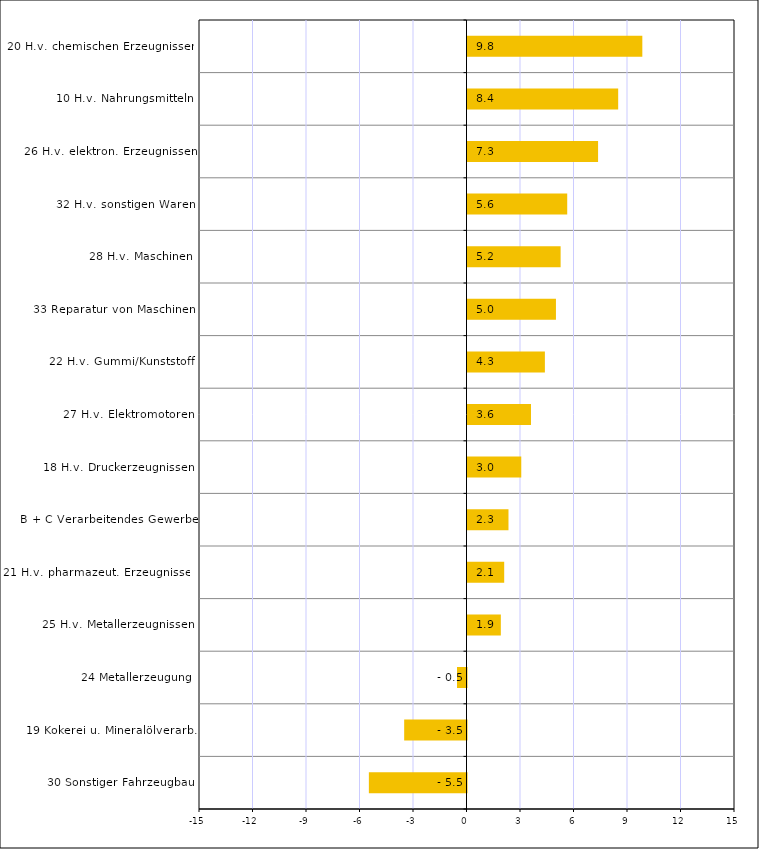
| Category | Series 0 |
|---|---|
| 30 Sonstiger Fahrzeugbau | -5.475 |
| 19 Kokerei u. Mineralölverarb. | -3.495 |
| 24 Metallerzeugung | -0.532 |
| 25 H.v. Metallerzeugnissen | 1.869 |
| 21 H.v. pharmazeut. Erzeugnissen | 2.058 |
| B + C Verarbeitendes Gewerbe | 2.298 |
| 18 H.v. Druckerzeugnissen | 3.015 |
| 27 H.v. Elektromotoren | 3.56 |
| 22 H.v. Gummi/Kunststoff | 4.34 |
| 33 Reparatur von Maschinen | 4.96 |
| 28 H.v. Maschinen | 5.222 |
| 32 H.v. sonstigen Waren | 5.592 |
| 26 H.v. elektron. Erzeugnissen | 7.322 |
| 10 H.v. Nahrungsmitteln | 8.449 |
| 20 H.v. chemischen Erzeugnissen | 9.803 |